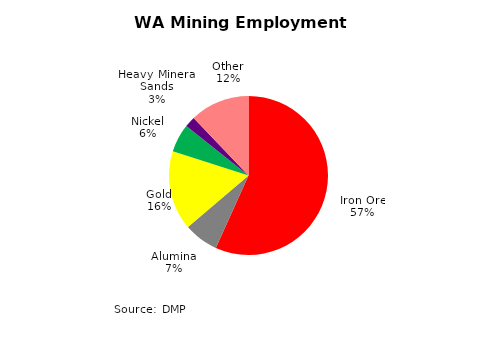
| Category | Series 0 |
|---|---|
| Iron Ore | 60844 |
| Alumina | 7531 |
| Gold | 17337 |
| Nickel | 6160 |
| Heavy Mineral Sands | 2343 |
| Other | 12998 |